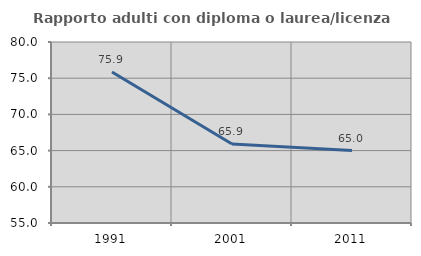
| Category | Rapporto adulti con diploma o laurea/licenza media  |
|---|---|
| 1991.0 | 75.862 |
| 2001.0 | 65.909 |
| 2011.0 | 65 |